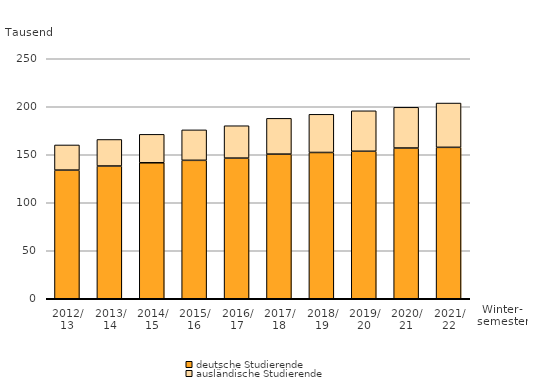
| Category | deutsche Studierende | ausländische Studierende |
|---|---|---|
| 2012/
13 | 133.987 | 26.233 |
| 2013/
14 | 138.273 | 27.65 |
| 2014/
15 | 141.638 | 29.625 |
| 2015/
16 | 144.192 | 31.725 |
| 2016/
17 | 146.492 | 33.743 |
| 2017/
18 | 150.66 | 37.274 |
| 2018/
19 | 152.364 | 39.765 |
| 2019/
20 | 153.644 | 42.155 |
| 2020/
21 | 157.007 | 42.414 |
| 2021/
22 | 157.725 | 46.144 |